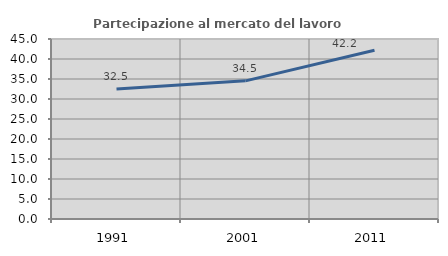
| Category | Partecipazione al mercato del lavoro  femminile |
|---|---|
| 1991.0 | 32.528 |
| 2001.0 | 34.532 |
| 2011.0 | 42.184 |